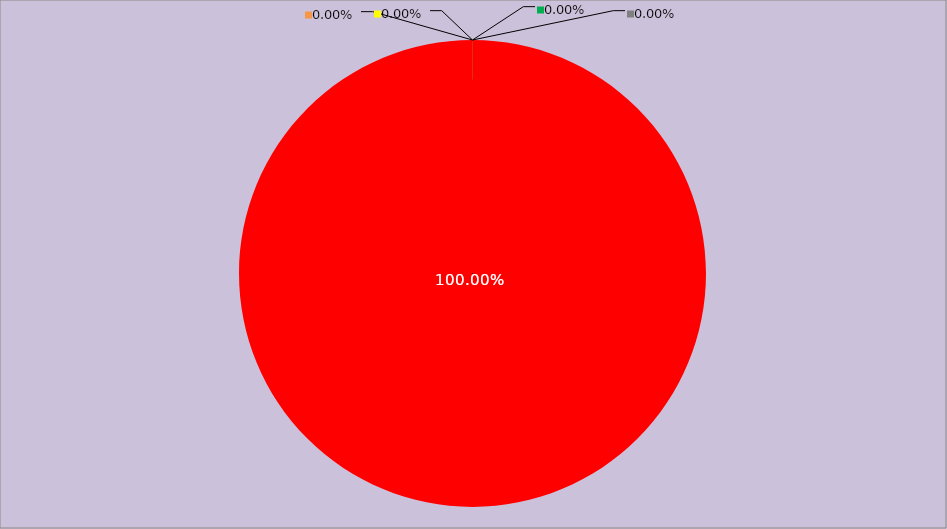
| Category | Année 2026 |
|---|---|
| Mesures non appliquées | 168 |
| Mesures appliquées mais peu ou pas documentées | 0 |
| Mesures appliquées et documentées | 0 |
| Mesures appliquées, documentées et contrôlées | 0 |
| Mesures non applicables | 0 |